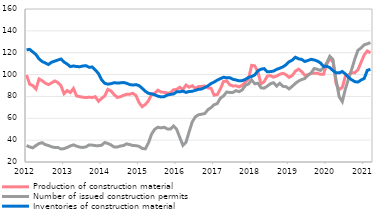
| Category | Production of construction material |
|---|---|
| 2012-01-01 | 99.636 |
| 2012-02-01 | 91.132 |
| 2012-03-01 | 89.889 |
| 2012-04-01 | 86.795 |
| 2012-05-01 | 96.019 |
| 2012-06-01 | 94.366 |
| 2012-07-01 | 92.13 |
| 2012-08-01 | 90.86 |
| 2012-09-01 | 92.338 |
| 2012-10-01 | 94.157 |
| 2012-11-01 | 92.776 |
| 2012-12-01 | 89.829 |
| 2013-01-01 | 82.476 |
| 2013-02-01 | 85.356 |
| 2013-03-01 | 83.58 |
| 2013-04-01 | 87.281 |
| 2013-05-01 | 80.436 |
| 2013-06-01 | 79.835 |
| 2013-07-01 | 79.308 |
| 2013-08-01 | 78.858 |
| 2013-09-01 | 79.375 |
| 2013-10-01 | 78.97 |
| 2013-11-01 | 79.785 |
| 2013-12-01 | 75.566 |
| 2014-01-01 | 78.195 |
| 2014-02-01 | 80.37 |
| 2014-03-01 | 86.492 |
| 2014-04-01 | 85.041 |
| 2014-05-01 | 81.733 |
| 2014-06-01 | 79.042 |
| 2014-07-01 | 79.741 |
| 2014-08-01 | 80.945 |
| 2014-09-01 | 81.998 |
| 2014-10-01 | 81.981 |
| 2014-11-01 | 82.919 |
| 2014-12-01 | 80.743 |
| 2015-01-01 | 74.317 |
| 2015-02-01 | 70.592 |
| 2015-03-01 | 72.698 |
| 2015-04-01 | 75.996 |
| 2015-05-01 | 82.008 |
| 2015-06-01 | 82.919 |
| 2015-07-01 | 85.743 |
| 2015-08-01 | 84.063 |
| 2015-09-01 | 83.695 |
| 2015-10-01 | 83.124 |
| 2015-11-01 | 83.299 |
| 2015-12-01 | 86.06 |
| 2016-01-01 | 86.359 |
| 2016-02-01 | 88.422 |
| 2016-03-01 | 86.232 |
| 2016-04-01 | 90.412 |
| 2016-05-01 | 88.424 |
| 2016-06-01 | 89.748 |
| 2016-07-01 | 87.294 |
| 2016-08-01 | 89.032 |
| 2016-09-01 | 89.16 |
| 2016-10-01 | 89.602 |
| 2016-11-01 | 87.844 |
| 2016-12-01 | 87.546 |
| 2017-01-01 | 81.106 |
| 2017-02-01 | 81.676 |
| 2017-03-01 | 86.824 |
| 2017-04-01 | 93.791 |
| 2017-05-01 | 94.222 |
| 2017-06-01 | 90.67 |
| 2017-07-01 | 89.566 |
| 2017-08-01 | 89.712 |
| 2017-09-01 | 88.726 |
| 2017-10-01 | 90.138 |
| 2017-11-01 | 93.074 |
| 2017-12-01 | 95.983 |
| 2018-01-01 | 108.44 |
| 2018-02-01 | 108.008 |
| 2018-03-01 | 102.409 |
| 2018-04-01 | 91.415 |
| 2018-05-01 | 93.457 |
| 2018-06-01 | 98.546 |
| 2018-07-01 | 99.067 |
| 2018-08-01 | 97.619 |
| 2018-09-01 | 98.675 |
| 2018-10-31 | 100.256 |
| 2018-11-30 | 101.149 |
| 2018-12-31 | 99.865 |
| 2019-01-31 | 97.48 |
| 2019-02-28 | 99.162 |
| 2019-03-31 | 103.132 |
| 2019-04-30 | 104.939 |
| 2019-05-31 | 102.719 |
| 2019-06-30 | 99.348 |
| 2019-07-31 | 99.8 |
| 2019-08-31 | 100.974 |
| 2019-09-30 | 101.264 |
| 2019-10-31 | 101.237 |
| 2019-11-30 | 100.196 |
| 2019-12-31 | 100.27 |
| 2020-01-31 | 109.445 |
| 2020-02-29 | 114.132 |
| 2020-03-31 | 111.907 |
| 2020-04-30 | 91.795 |
| 2020-05-31 | 86.193 |
| 2020-06-30 | 88.281 |
| 2020-07-31 | 98.783 |
| 2020-08-31 | 99.84 |
| 2020-09-30 | 101.677 |
| 2020-10-31 | 101.746 |
| 2020-11-30 | 104.386 |
| 2020-12-31 | 111.188 |
| 2021-01-31 | 117.94 |
| 2021-02-28 | 121.599 |
| 2021-03-31 | 119.794 |